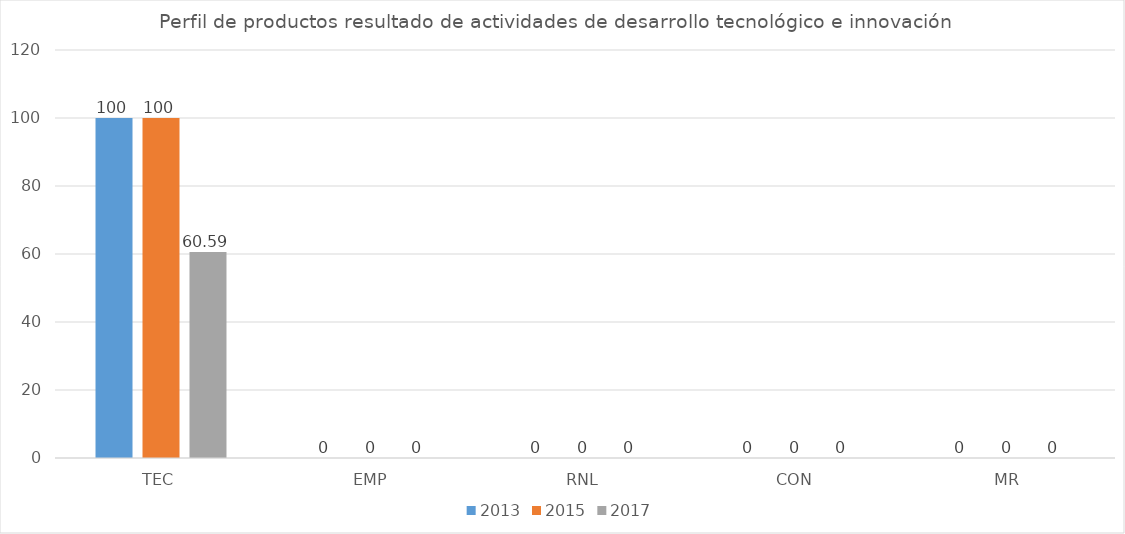
| Category | 2013 | 2015 | 2017 |
|---|---|---|---|
| TEC | 100 | 100 | 60.59 |
| EMP | 0 | 0 | 0 |
| RNL | 0 | 0 | 0 |
| CON | 0 | 0 | 0 |
| MR | 0 | 0 | 0 |